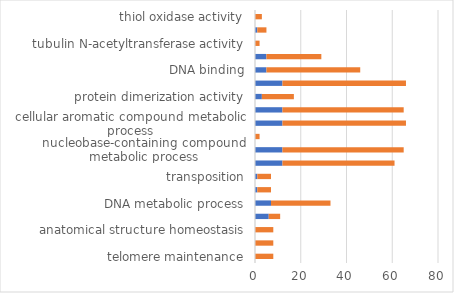
| Category | up-regulated | down-regulated |
|---|---|---|
| telomere maintenance | 0 | 8 |
| telomere organization | 0 | 8 |
| anatomical structure homeostasis | 0 | 8 |
| DNA integration | 6 | 5 |
| DNA metabolic process | 7 | 26 |
| transposition, DNA-mediated | 1 | 6 |
| transposition | 1 | 6 |
| nucleic acid metabolic process | 12 | 49 |
| nucleobase-containing compound metabolic process | 12 | 53 |
| alpha-tubulin acetylation | 0 | 2 |
| cellular aromatic compound metabolic process | 12 | 54 |
| heterocycle metabolic process | 12 | 53 |
| protein dimerization activity | 3 | 14 |
| nucleic acid binding | 12 | 54 |
| DNA binding | 5 | 41 |
| zinc ion binding | 5 | 24 |
| tubulin N-acetyltransferase activity | 0 | 2 |
| transposase activity | 1 | 4 |
| thiol oxidase activity | 0 | 3 |